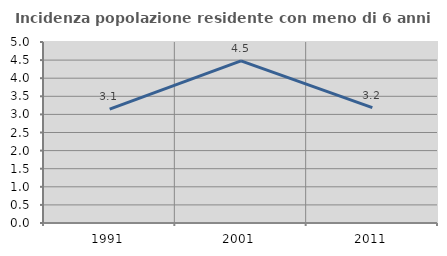
| Category | Incidenza popolazione residente con meno di 6 anni |
|---|---|
| 1991.0 | 3.146 |
| 2001.0 | 4.481 |
| 2011.0 | 3.189 |